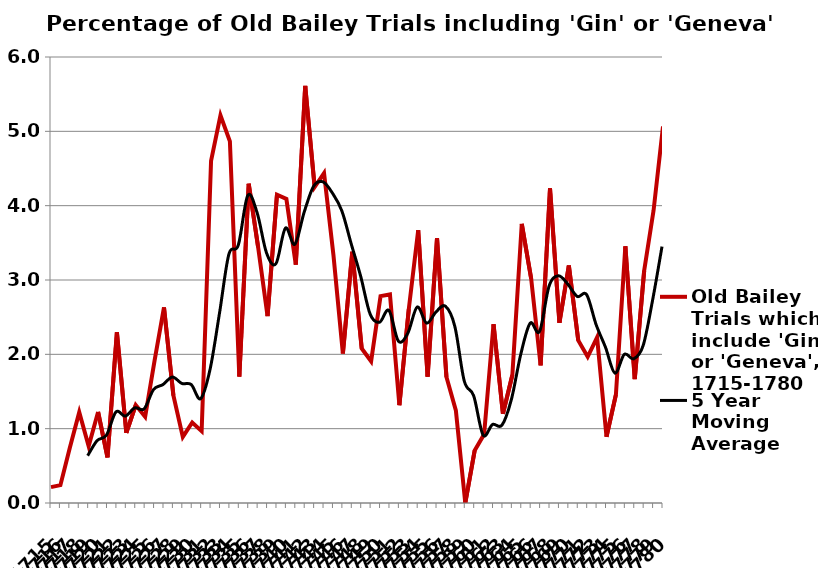
| Category | Old Bailey Trials which include 'Gin' or 'Geneva', 1715-1780 |
|---|---|
| 1715 | 0.213 |
| 1716 | 0.24 |
| 1717 | 0.743 |
| 1718 | 1.222 |
| 1719 | 0.763 |
| 1720 | 1.225 |
| 1721 | 0.613 |
| 1722 | 2.299 |
| 1723 | 0.943 |
| 1724 | 1.318 |
| 1725 | 1.159 |
| 1726 | 1.916 |
| 1727 | 2.632 |
| 1728 | 1.446 |
| 1729 | 0.89 |
| 1730 | 1.083 |
| 1731 | 0.967 |
| 1732 | 4.603 |
| 1733 | 5.215 |
| 1734 | 4.866 |
| 1735 | 1.701 |
| 1736 | 4.294 |
| 1737 | 3.44 |
| 1738 | 2.514 |
| 1739 | 4.148 |
| 1740 | 4.091 |
| 1741 | 3.206 |
| 1742 | 5.612 |
| 1743 | 4.251 |
| 1744 | 4.439 |
| 1745 | 3.333 |
| 1746 | 2.011 |
| 1747 | 3.38 |
| 1748 | 2.079 |
| 1749 | 1.906 |
| 1750 | 2.783 |
| 1751 | 2.806 |
| 1752 | 1.316 |
| 1753 | 2.609 |
| 1754 | 3.67 |
| 1755 | 1.7 |
| 1756 | 3.562 |
| 1757 | 1.695 |
| 1758 | 1.246 |
| 1759 | 0 |
| 1760 | 0.707 |
| 1761 | 0.923 |
| 1762 | 2.405 |
| 1763 | 1.199 |
| 1764 | 1.721 |
| 1765 | 3.756 |
| 1766 | 3.017 |
| 1767 | 1.852 |
| 1768 | 4.234 |
| 1769 | 2.424 |
| 1770 | 3.195 |
| 1771 | 2.188 |
| 1772 | 1.967 |
| 1773 | 2.229 |
| 1774 | 0.892 |
| 1775 | 1.459 |
| 1776 | 3.454 |
| 1777 | 1.667 |
| 1778 | 3.125 |
| 1779 | 3.937 |
| 1780 | 5.066 |